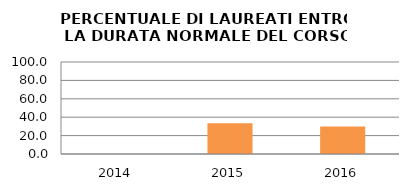
| Category | 2014 2015 2016 |
|---|---|
| 2014.0 | 0 |
| 2015.0 | 33.333 |
| 2016.0 | 30 |